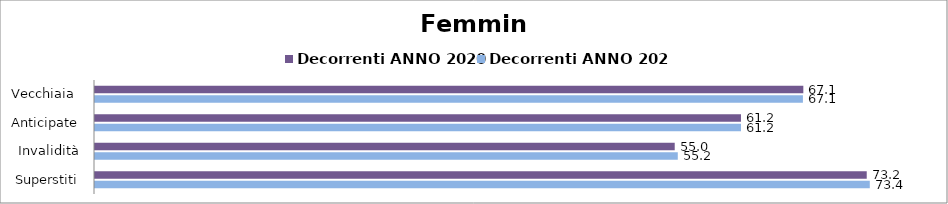
| Category | Decorrenti ANNO 2020 | Decorrenti ANNO 2021 |
|---|---|---|
| Vecchiaia  | 67.14 | 67.1 |
| Anticipate | 61.23 | 61.23 |
| Invalidità | 54.95 | 55.24 |
| Superstiti | 73.15 | 73.44 |